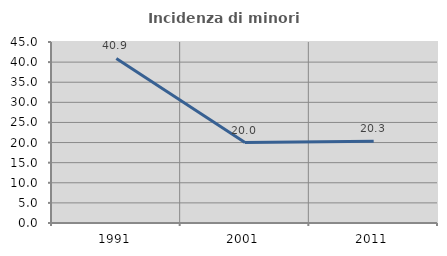
| Category | Incidenza di minori stranieri |
|---|---|
| 1991.0 | 40.909 |
| 2001.0 | 20 |
| 2011.0 | 20.317 |